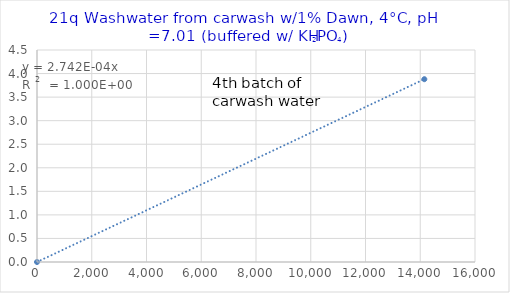
| Category | Series 0 |
|---|---|
| 0.0 | 0 |
| 14149.076517150397 | 3.88 |